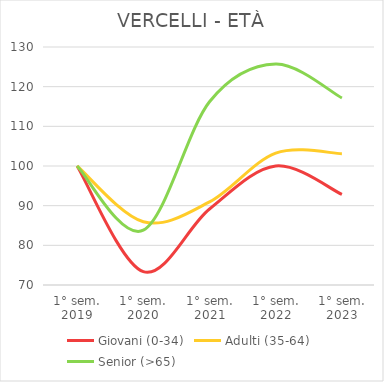
| Category | Giovani (0-34) | Adulti (35-64) | Senior (>65) |
|---|---|---|---|
| 1° sem.
2019 | 100 | 100 | 100 |
| 1° sem.
2020 | 73.357 | 85.953 | 83.81 |
| 1° sem.
2021 | 89.16 | 90.955 | 116.19 |
| 1° sem.
2022 | 100 | 103.25 | 125.714 |
| 1° sem.
2023 | 92.836 | 103.081 | 117.143 |